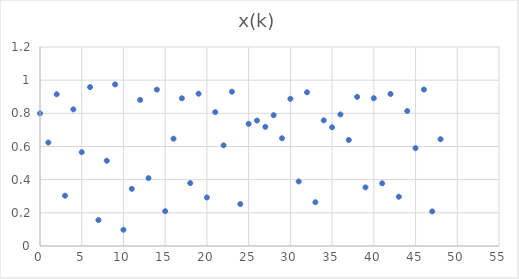
| Category | x(k) |
|---|---|
| 0.0 | 0.8 |
| 1.0 | 0.624 |
| 2.0 | 0.915 |
| 3.0 | 0.303 |
| 4.0 | 0.824 |
| 5.0 | 0.566 |
| 6.0 | 0.958 |
| 7.0 | 0.156 |
| 8.0 | 0.514 |
| 9.0 | 0.974 |
| 10.0 | 0.098 |
| 11.0 | 0.345 |
| 12.0 | 0.881 |
| 13.0 | 0.409 |
| 14.0 | 0.943 |
| 15.0 | 0.21 |
| 16.0 | 0.647 |
| 17.0 | 0.891 |
| 18.0 | 0.379 |
| 19.0 | 0.918 |
| 20.0 | 0.293 |
| 21.0 | 0.807 |
| 22.0 | 0.607 |
| 23.0 | 0.93 |
| 24.0 | 0.253 |
| 25.0 | 0.737 |
| 26.0 | 0.756 |
| 27.0 | 0.718 |
| 28.0 | 0.789 |
| 29.0 | 0.65 |
| 30.0 | 0.888 |
| 31.0 | 0.389 |
| 32.0 | 0.927 |
| 33.0 | 0.264 |
| 34.0 | 0.758 |
| 35.0 | 0.716 |
| 36.0 | 0.793 |
| 37.0 | 0.639 |
| 38.0 | 0.899 |
| 39.0 | 0.353 |
| 40.0 | 0.891 |
| 41.0 | 0.378 |
| 42.0 | 0.917 |
| 43.0 | 0.297 |
| 44.0 | 0.814 |
| 45.0 | 0.59 |
| 46.0 | 0.943 |
| 47.0 | 0.209 |
| 48.0 | 0.644 |